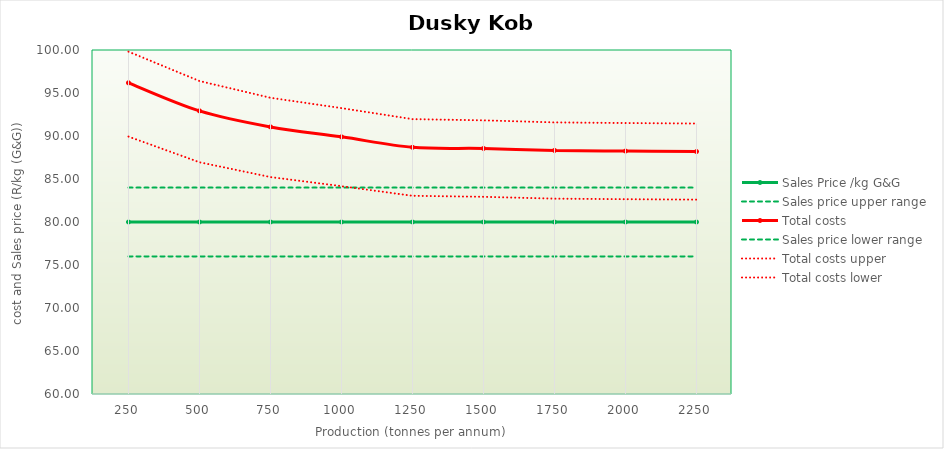
| Category | Sales Price /kg G&G | Sales price upper range | Total costs | Sales price lower range | Total costs upper | Total costs lower |
|---|---|---|---|---|---|---|
| 250.0 | 80 | 84 | 96.184 | 76 | 99.807 | 89.931 |
| 500.0 | 80 | 84 | 92.92 | 76 | 96.391 | 86.947 |
| 750.0 | 80 | 84 | 91.056 | 76 | 94.443 | 85.226 |
| 1000.0 | 80 | 84 | 89.903 | 76 | 93.243 | 84.164 |
| 1250.0 | 80 | 84 | 88.682 | 76 | 91.961 | 83.047 |
| 1500.0 | 80 | 84 | 88.548 | 76 | 91.821 | 82.927 |
| 1750.0 | 80 | 84 | 88.322 | 76 | 91.583 | 82.716 |
| 2000.0 | 80 | 84 | 88.25 | 76 | 91.508 | 82.652 |
| 2250.0 | 80 | 84 | 88.195 | 76 | 91.449 | 82.602 |